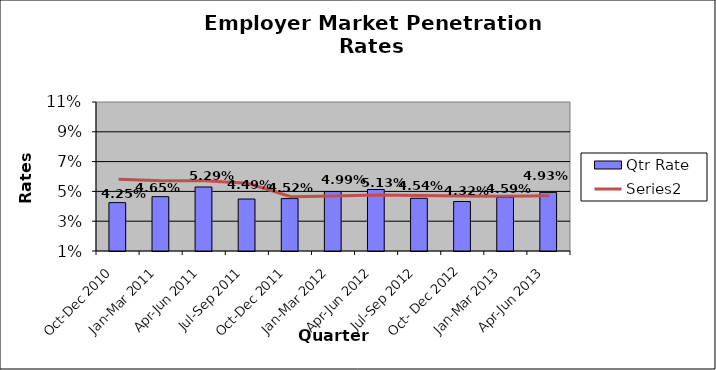
| Category | Qtr Rate |
|---|---|
| Oct-Dec 2010 | 0.042 |
| Jan-Mar 2011 | 0.046 |
| Apr-Jun 2011 | 0.053 |
| Jul-Sep 2011 | 0.045 |
| Oct-Dec 2011 | 0.045 |
| Jan-Mar 2012 | 0.05 |
| Apr-Jun 2012 | 0.051 |
| Jul-Sep 2012 | 0.045 |
| Oct- Dec 2012 | 0.043 |
| Jan-Mar 2013 | 0.046 |
| Apr-Jun 2013 | 0.049 |